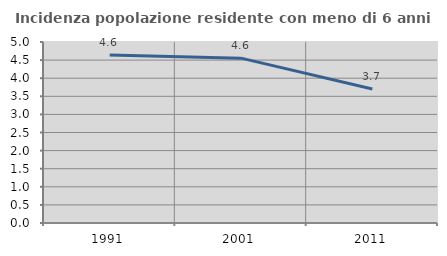
| Category | Incidenza popolazione residente con meno di 6 anni |
|---|---|
| 1991.0 | 4.643 |
| 2001.0 | 4.554 |
| 2011.0 | 3.704 |